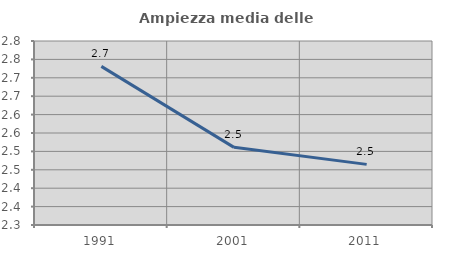
| Category | Ampiezza media delle famiglie |
|---|---|
| 1991.0 | 2.731 |
| 2001.0 | 2.511 |
| 2011.0 | 2.465 |